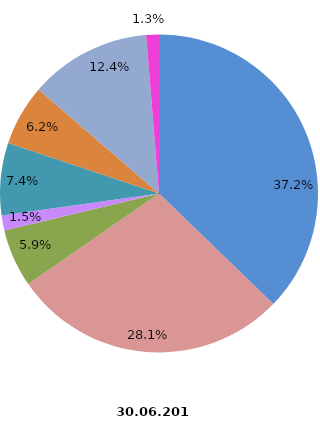
| Category | Anzahl Beschäftigte 2016 |
|---|---|
| Elektroinstallation | 5220 |
| Gas-, Wasser-, Heizungs- sowie Lüftungs- und Klimainstallation | 3940 |
| Sonstige Bauinstallation | 829 |
| Anbringen von Stuckaturen, Gipserei und Verputzerei | 211 |
| Bautischlerei und -schlosserei | 1031 |
| Fußboden-, Fliesen- und Plattenlegerei, Tapeziererei | 869 |
| Malerei und Glaserei | 1734 |
| Sonstiger Ausbau a. n. g. | 181 |